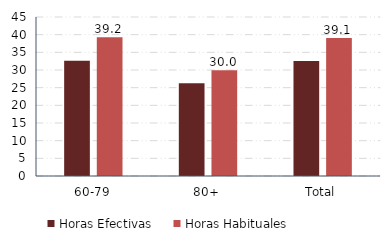
| Category | Horas Efectivas | Horas Habituales |
|---|---|---|
| 60-79 | 32.619 | 39.243 |
| 80+ | 26.227 | 29.956 |
| Total | 32.512 | 39.088 |